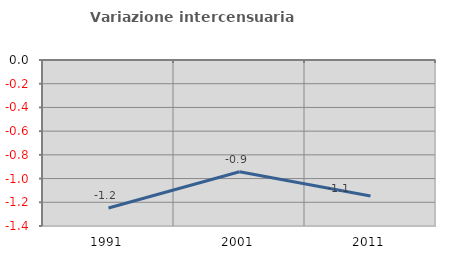
| Category | Variazione intercensuaria annua |
|---|---|
| 1991.0 | -1.248 |
| 2001.0 | -0.942 |
| 2011.0 | -1.147 |